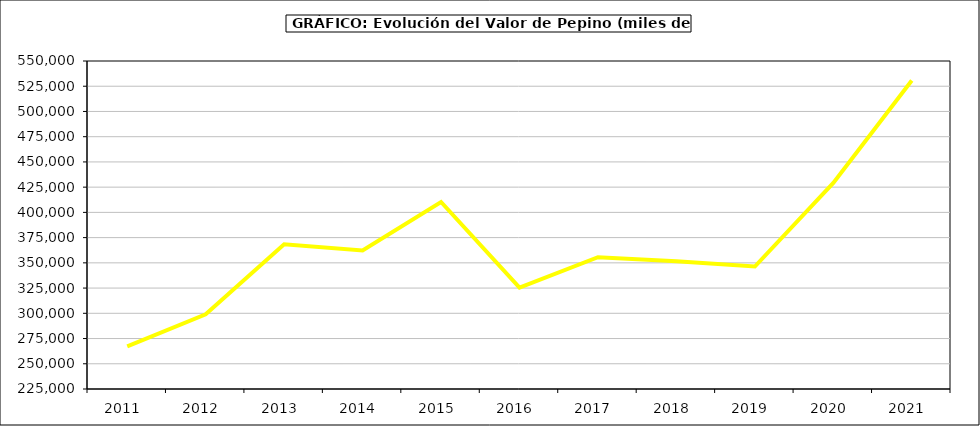
| Category | Valor |
|---|---|
| 2011.0 | 267189.859 |
| 2012.0 | 298950.9 |
| 2013.0 | 368300.179 |
| 2014.0 | 362347 |
| 2015.0 | 410299 |
| 2016.0 | 325360 |
| 2017.0 | 355598.015 |
| 2018.0 | 351610.152 |
| 2019.0 | 346372.719 |
| 2020.0 | 429148.693 |
| 2021.0 | 530680.102 |